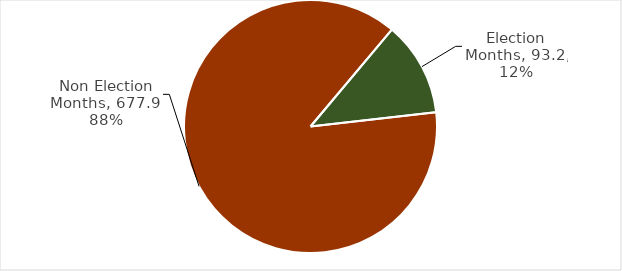
| Category | Total Grants |
|---|---|
| Election Months | 93.198 |
| Non Election Months | 677.9 |